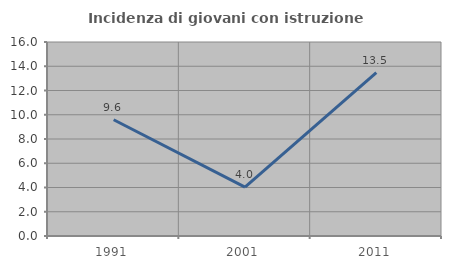
| Category | Incidenza di giovani con istruzione universitaria |
|---|---|
| 1991.0 | 9.589 |
| 2001.0 | 4.027 |
| 2011.0 | 13.475 |